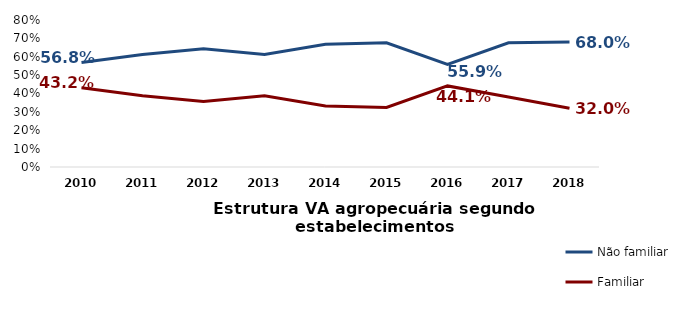
| Category | Não familiar | Familiar |
|---|---|---|
| 2010.0 | 0.568 | 0.432 |
| 2011.0 | 0.612 | 0.388 |
| 2012.0 | 0.644 | 0.356 |
| 2013.0 | 0.613 | 0.387 |
| 2014.0 | 0.668 | 0.332 |
| 2015.0 | 0.676 | 0.324 |
| 2016.0 | 0.559 | 0.441 |
| 2017.0 | 0.676 | 0.381 |
| 2018.0 | 0.68 | 0.32 |